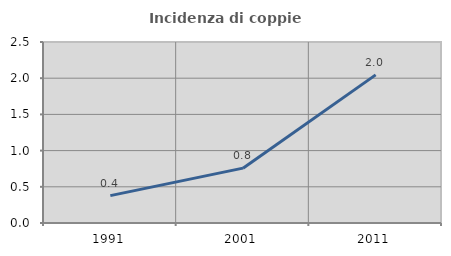
| Category | Incidenza di coppie miste |
|---|---|
| 1991.0 | 0.378 |
| 2001.0 | 0.758 |
| 2011.0 | 2.046 |